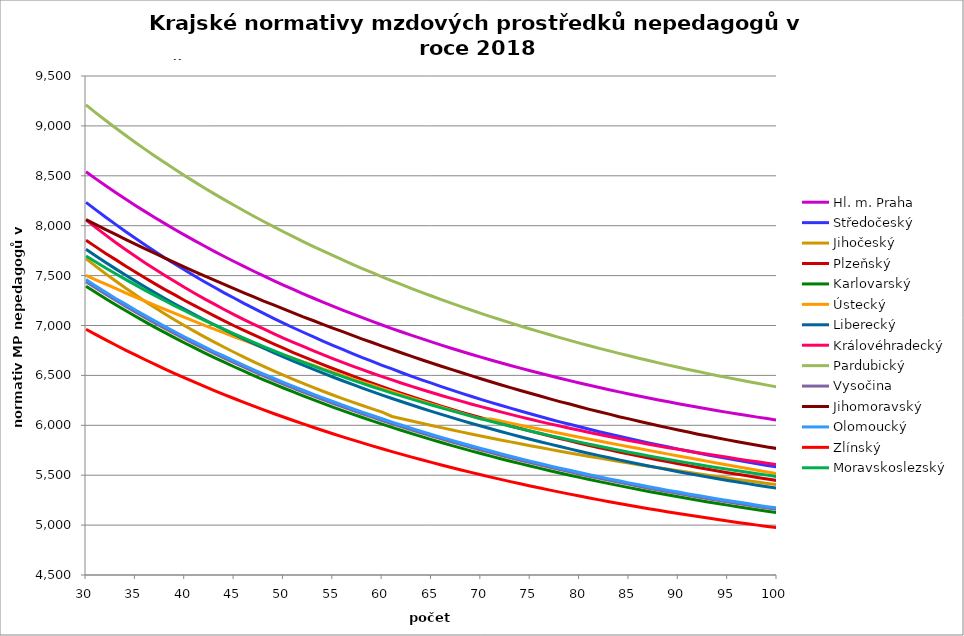
| Category | Hl. m. Praha | Středočeský | Jihočeský | Plzeňský | Karlovarský  | Ústecký   | Liberecký | Královéhradecký | Pardubický | Vysočina | Jihomoravský | Olomoucký | Zlínský | Moravskoslezský |
|---|---|---|---|---|---|---|---|---|---|---|---|---|---|---|
| 30.0 | 8539.701 | 8233.211 | 7669.435 | 7854.668 | 7393.853 | 7502.552 | 7763.411 | 8057.802 | 9210.15 | 7439.113 | 8061.516 | 7460.424 | 6962.583 | 7697.208 |
| 31.0 | 8469.05 | 8158.608 | 7592.32 | 7787.782 | 7330.51 | 7456.418 | 7696.406 | 7981.119 | 9131.246 | 7375.491 | 8011.168 | 7394.475 | 6908.645 | 7636.283 |
| 32.0 | 8400.15 | 8085.345 | 7517.656 | 7722.026 | 7268.722 | 7413.68 | 7631.055 | 7905.882 | 9054.28 | 7313.216 | 7961.446 | 7332.359 | 6855.947 | 7576.796 |
| 33.0 | 8332.945 | 8013.386 | 7445.345 | 7660.16 | 7208.44 | 7371.429 | 7567.303 | 7832.051 | 8979.19 | 7252.512 | 7912.337 | 7271.279 | 6804.45 | 7518.702 |
| 34.0 | 8267.38 | 7942.696 | 7375.293 | 7596.533 | 7149.615 | 7326.888 | 7505.1 | 7762.458 | 8905.914 | 7193.327 | 7863.83 | 7213.798 | 6754.119 | 7461.958 |
| 35.0 | 8203.403 | 7873.242 | 7307.413 | 7536.654 | 7092.199 | 7285.618 | 7444.394 | 7694.092 | 8834.393 | 7135.611 | 7815.914 | 7154.669 | 6704.919 | 7406.523 |
| 36.0 | 8140.964 | 7807.7 | 7241.62 | 7475.053 | 7036.147 | 7244.81 | 7385.138 | 7626.919 | 8764.573 | 7079.318 | 7768.579 | 7099.01 | 6656.817 | 7352.359 |
| 37.0 | 8080.017 | 7740.578 | 7177.838 | 7417.066 | 6981.418 | 7201.782 | 7327.286 | 7563.636 | 8696.4 | 7024.153 | 7721.813 | 7044.211 | 6609.782 | 7299.426 |
| 38.0 | 8020.515 | 7677.217 | 7115.989 | 7359.972 | 6927.97 | 7161.905 | 7270.795 | 7501.395 | 8629.822 | 6970.329 | 7675.607 | 6990.251 | 6563.782 | 7247.691 |
| 39.0 | 7962.415 | 7617.462 | 7056.005 | 7306.287 | 6875.764 | 7122.467 | 7215.623 | 7440.17 | 8564.792 | 6917.804 | 7629.951 | 6937.111 | 6518.789 | 7197.117 |
| 40.0 | 7905.674 | 7556.093 | 6997.817 | 7250.879 | 6824.762 | 7080.876 | 7161.728 | 7379.937 | 8501.261 | 6866.538 | 7584.835 | 6884.774 | 6474.774 | 7147.672 |
| 41.0 | 7850.254 | 7495.704 | 6941.361 | 7198.768 | 6774.929 | 7042.323 | 7109.074 | 7323.227 | 8439.186 | 6816.493 | 7540.249 | 6835.546 | 6431.71 | 7099.323 |
| 42.0 | 7796.115 | 7438.731 | 6886.578 | 7147.401 | 6726.229 | 7001.66 | 7057.623 | 7267.383 | 8378.524 | 6767.402 | 7496.184 | 6787.018 | 6389.572 | 7052.041 |
| 43.0 | 7743.221 | 7382.617 | 6833.41 | 7096.761 | 6678.63 | 6963.963 | 7007.339 | 7214.866 | 8319.232 | 6719.466 | 7455.179 | 6736.913 | 6348.333 | 7005.795 |
| 44.0 | 7691.536 | 7327.344 | 6781.803 | 7046.834 | 6632.099 | 6926.669 | 6958.189 | 7160.656 | 8261.271 | 6672.651 | 7412.101 | 6692 | 6307.971 | 6960.557 |
| 45.0 | 7641.026 | 7275.242 | 6731.703 | 6997.605 | 6586.607 | 6887.327 | 6910.141 | 7109.664 | 8204.604 | 6626.925 | 7369.517 | 6645.482 | 6268.461 | 6916.3 |
| 46.0 | 7591.658 | 7221.559 | 6683.062 | 6951.355 | 6542.124 | 6850.847 | 6863.162 | 7059.394 | 8149.193 | 6582.257 | 7327.419 | 6599.606 | 6229.781 | 6872.998 |
| 47.0 | 7543.402 | 7170.946 | 6635.833 | 6905.712 | 6498.622 | 6814.752 | 6817.223 | 7012.174 | 8095.004 | 6538.401 | 7285.8 | 6556.499 | 6191.911 | 6830.625 |
| 48.0 | 7496.227 | 7121.038 | 6589.97 | 6860.665 | 6456.073 | 6776.668 | 6772.295 | 6965.581 | 8042.003 | 6495.549 | 7244.651 | 6513.952 | 6154.828 | 6789.157 |
| 49.0 | 7450.103 | 7071.819 | 6545.432 | 6816.202 | 6414.451 | 6741.348 | 6728.351 | 6919.604 | 7990.158 | 6453.674 | 7206.345 | 6471.954 | 6118.514 | 6748.571 |
| 50.0 | 7405.004 | 7023.276 | 6502.177 | 6772.312 | 6373.732 | 6706.395 | 6685.363 | 6874.23 | 7939.437 | 6412.747 | 7166.086 | 6430.493 | 6082.948 | 6708.844 |
| 51.0 | 7360.902 | 6977.557 | 6460.166 | 6728.983 | 6333.892 | 6669.508 | 6643.305 | 6831.672 | 7889.809 | 6372.745 | 7126.275 | 6389.561 | 6048.112 | 6669.955 |
| 52.0 | 7317.772 | 6932.43 | 6419.363 | 6688.331 | 6294.907 | 6635.294 | 6602.154 | 6789.637 | 7841.247 | 6333.439 | 7086.903 | 6351.155 | 6013.988 | 6631.882 |
| 53.0 | 7275.588 | 6887.882 | 6379.731 | 6648.167 | 6256.754 | 6601.429 | 6561.885 | 6748.117 | 7793.723 | 6295.014 | 7050.242 | 6313.208 | 5980.56 | 6594.605 |
| 54.0 | 7234.327 | 6843.904 | 6341.238 | 6608.483 | 6219.413 | 6565.685 | 6522.475 | 6707.102 | 7747.209 | 6257.444 | 7011.704 | 6275.711 | 5947.809 | 6558.105 |
| 55.0 | 7193.965 | 6800.483 | 6303.85 | 6569.269 | 6182.863 | 6532.525 | 6483.903 | 6668.702 | 7701.68 | 6220.709 | 6973.585 | 6238.658 | 5915.721 | 6522.363 |
| 56.0 | 7154.48 | 6759.64 | 6267.538 | 6532.547 | 6147.083 | 6499.698 | 6446.146 | 6630.74 | 7657.111 | 6184.787 | 6938.085 | 6202.039 | 5884.278 | 6487.361 |
| 57.0 | 7115.851 | 6719.284 | 6232.271 | 6494.227 | 6112.054 | 6465.045 | 6409.185 | 6593.208 | 7613.477 | 6149.468 | 6900.759 | 6165.848 | 5853.468 | 6453.081 |
| 58.0 | 7078.058 | 6677.425 | 6198.021 | 6458.336 | 6077.758 | 6432.891 | 6373 | 6558.148 | 7570.757 | 6114.924 | 6863.834 | 6131.949 | 5823.273 | 6419.507 |
| 59.0 | 7041.08 | 6640 | 6164.762 | 6422.84 | 6044.177 | 6401.056 | 6337.571 | 6521.431 | 7528.926 | 6081.138 | 6829.439 | 6098.42 | 5793.682 | 6386.621 |
| 60.0 | 7004.897 | 6601.056 | 6132.468 | 6387.732 | 6011.294 | 6367.443 | 6302.881 | 6487.129 | 7487.965 | 6048.09 | 6793.271 | 6065.257 | 5764.68 | 6354.409 |
| 61.0 | 6969.492 | 6564.479 | 6088.277 | 6353.005 | 5979.091 | 6336.251 | 6268.911 | 6455.172 | 7447.852 | 6015.763 | 6759.578 | 6032.452 | 5736.253 | 6322.854 |
| 62.0 | 6934.847 | 6526.413 | 6065.288 | 6320.553 | 5947.553 | 6305.362 | 6235.645 | 6421.562 | 7408.567 | 5983.96 | 6724.144 | 6000 | 5708.39 | 6291.943 |
| 63.0 | 6900.944 | 6490.657 | 6042.645 | 6286.551 | 5916.665 | 6272.745 | 6203.065 | 6390.247 | 7370.09 | 5952.846 | 6691.132 | 5969.67 | 5681.077 | 6261.661 |
| 64.0 | 6867.766 | 6455.291 | 6020.342 | 6254.773 | 5886.41 | 6242.471 | 6171.156 | 6359.236 | 7332.404 | 5922.407 | 6656.41 | 5939.645 | 5654.304 | 6231.994 |
| 65.0 | 6835.298 | 6422.14 | 5998.374 | 6223.314 | 5856.775 | 6212.488 | 6139.903 | 6328.524 | 7295.489 | 5892.626 | 6624.058 | 5908.181 | 5628.058 | 6202.929 |
| 66.0 | 6803.524 | 6387.514 | 5976.735 | 6192.17 | 5827.746 | 6180.822 | 6109.29 | 6298.108 | 7259.329 | 5863.488 | 6592.019 | 5878.77 | 5602.328 | 6174.453 |
| 67.0 | 6772.428 | 6355.054 | 5955.42 | 6161.336 | 5799.309 | 6151.427 | 6079.303 | 6269.856 | 7223.906 | 5834.808 | 6560.289 | 5851.355 | 5577.104 | 6146.554 |
| 68.0 | 6741.997 | 6322.921 | 5934.423 | 6132.595 | 5771.451 | 6122.31 | 6049.929 | 6241.858 | 7189.204 | 5806.745 | 6528.862 | 5822.506 | 5552.375 | 6119.219 |
| 69.0 | 6712.216 | 6291.112 | 5913.74 | 6104.121 | 5744.159 | 6091.554 | 6021.153 | 6214.108 | 7155.208 | 5779.286 | 6497.735 | 5795.612 | 5528.13 | 6092.437 |
| 70.0 | 6683.071 | 6259.622 | 5893.366 | 6075.91 | 5717.421 | 6063 | 5992.963 | 6186.604 | 7121.902 | 5752.418 | 6466.904 | 5768.966 | 5504.361 | 6066.196 |
| 71.0 | 6654.55 | 6230.169 | 5873.295 | 6047.959 | 5691.225 | 6063 | 5965.346 | 6161.152 | 7089.272 | 5726.128 | 6436.364 | 5742.563 | 5481.057 | 6040.486 |
| 72.0 | 6626.64 | 6200.992 | 5853.523 | 6020.263 | 5665.56 | 6042.23 | 5938.29 | 6134.114 | 7057.302 | 5700.24 | 6406.11 | 5716.401 | 5458.21 | 6015.295 |
| 73.0 | 6599.328 | 6172.087 | 5834.045 | 5992.821 | 5640.415 | 6021.601 | 5911.784 | 6109.091 | 7025.98 | 5674.909 | 6378.005 | 5690.476 | 5435.81 | 5990.615 |
| 74.0 | 6572.603 | 6143.45 | 5814.856 | 5967.319 | 5615.779 | 6001.114 | 5885.815 | 6084.272 | 6995.292 | 5650.122 | 6348.297 | 5666.384 | 5413.849 | 5966.434 |
| 75.0 | 6546.453 | 6115.077 | 5795.953 | 5942.034 | 5591.641 | 5980.764 | 5860.372 | 6061.405 | 6965.224 | 5625.868 | 6320.696 | 5640.91 | 5392.318 | 5942.743 |
| 76.0 | 6520.867 | 6088.612 | 5777.331 | 5916.962 | 5567.991 | 5960.553 | 5835.446 | 6036.971 | 6935.766 | 5602.137 | 6293.333 | 5617.236 | 5371.209 | 5919.533 |
| 77.0 | 6495.834 | 6060.743 | 5758.985 | 5892.101 | 5544.821 | 5940.478 | 5811.026 | 6014.458 | 6906.903 | 5578.762 | 6264.407 | 5593.759 | 5350.515 | 5896.794 |
| 78.0 | 6471.344 | 6034.745 | 5740.912 | 5867.448 | 5522.119 | 5920.537 | 5787.101 | 5992.112 | 6878.625 | 5555.89 | 6237.529 | 5570.477 | 5330.227 | 5874.519 |
| 79.0 | 6447.387 | 6010.574 | 5723.107 | 5844.624 | 5499.878 | 5900.73 | 5763.662 | 5969.932 | 6850.92 | 5533.513 | 6212.65 | 5548.922 | 5310.338 | 5852.698 |
| 80.0 | 6423.952 | 5985.004 | 5705.567 | 5820.365 | 5478.088 | 5881.055 | 5740.7 | 5949.603 | 6823.777 | 5511.62 | 6186.213 | 5527.533 | 5290.842 | 5831.323 |
| 81.0 | 6401.031 | 5959.651 | 5688.287 | 5797.905 | 5456.74 | 5861.511 | 5718.205 | 5927.735 | 6797.186 | 5490.203 | 6160 | 5504.798 | 5271.731 | 5810.386 |
| 82.0 | 6378.614 | 5936.076 | 5671.265 | 5775.618 | 5435.827 | 5842.096 | 5696.169 | 5907.692 | 6771.135 | 5469.101 | 6135.734 | 5483.748 | 5252.997 | 5789.88 |
| 83.0 | 6356.693 | 5912.687 | 5654.496 | 5755.075 | 5415.34 | 5822.809 | 5674.583 | 5887.784 | 6745.616 | 5448.459 | 6111.659 | 5462.857 | 5234.636 | 5769.796 |
| 84.0 | 6335.258 | 5889.482 | 5637.976 | 5733.115 | 5395.272 | 5803.649 | 5653.438 | 5868.01 | 6720.617 | 5428.268 | 6086.073 | 5443.601 | 5216.64 | 5750.128 |
| 85.0 | 6314.303 | 5867.987 | 5621.703 | 5712.873 | 5375.614 | 5784.615 | 5632.728 | 5848.368 | 6696.131 | 5408.52 | 6064.071 | 5423.015 | 5199.002 | 5730.869 |
| 86.0 | 6293.817 | 5845.131 | 5605.672 | 5691.234 | 5356.36 | 5767.42 | 5612.443 | 5830.478 | 6672.147 | 5389.206 | 6040.554 | 5404.038 | 5181.718 | 5712.012 |
| 87.0 | 6273.794 | 5823.959 | 5589.881 | 5671.286 | 5337.503 | 5748.622 | 5592.577 | 5811.086 | 6648.657 | 5370.175 | 6017.219 | 5385.193 | 5164.781 | 5693.549 |
| 88.0 | 6254.227 | 5802.939 | 5574.326 | 5651.478 | 5319.035 | 5729.947 | 5573.122 | 5793.424 | 6625.653 | 5351.565 | 5995.711 | 5366.48 | 5148.186 | 5675.476 |
| 89.0 | 6235.107 | 5782.07 | 5559.004 | 5633.315 | 5300.949 | 5711.392 | 5554.07 | 5775.868 | 6603.125 | 5333.369 | 5974.356 | 5347.896 | 5131.926 | 5657.784 |
| 90.0 | 6216.428 | 5761.351 | 5543.912 | 5613.771 | 5283.24 | 5692.958 | 5535.416 | 5760 | 6581.066 | 5315.58 | 5953.153 | 5330.855 | 5115.998 | 5640.469 |
| 91.0 | 6198.182 | 5742.245 | 5529.046 | 5595.85 | 5265.901 | 5674.642 | 5517.153 | 5742.646 | 6559.467 | 5298.191 | 5932.1 | 5312.517 | 5100.394 | 5623.524 |
| 92.0 | 6180.364 | 5723.265 | 5514.405 | 5578.043 | 5248.926 | 5656.443 | 5499.273 | 5725.396 | 6538.322 | 5281.056 | 5911.195 | 5295.7 | 5085.112 | 5606.944 |
| 93.0 | 6162.967 | 5702.964 | 5499.984 | 5560.349 | 5232.309 | 5638.361 | 5481.771 | 5709.804 | 6517.623 | 5264.309 | 5892.029 | 5278.99 | 5070.144 | 5590.723 |
| 94.0 | 6145.984 | 5685.678 | 5485.781 | 5542.767 | 5216.044 | 5620.394 | 5464.64 | 5694.297 | 6497.363 | 5247.945 | 5872.987 | 5262.385 | 5055.488 | 5574.856 |
| 95.0 | 6129.41 | 5667.069 | 5471.793 | 5525.296 | 5200.126 | 5602.541 | 5447.875 | 5678.873 | 6477.534 | 5231.957 | 5854.067 | 5245.885 | 5041.137 | 5559.337 |
| 96.0 | 6113.239 | 5648.582 | 5458.018 | 5509.377 | 5184.549 | 5584.801 | 5431.47 | 5663.533 | 6458.131 | 5216.339 | 5835.269 | 5230.849 | 5027.089 | 5544.162 |
| 97.0 | 6097.464 | 5631.624 | 5444.453 | 5493.549 | 5169.308 | 5567.174 | 5415.419 | 5648.276 | 6439.146 | 5200.95 | 5818.143 | 5215.9 | 5013.337 | 5529.326 |
| 98.0 | 6082.081 | 5614.767 | 5431.095 | 5477.812 | 5154.398 | 5549.657 | 5399.717 | 5634.614 | 6420.573 | 5185.922 | 5801.117 | 5199.689 | 4999.879 | 5514.823 |
| 99.0 | 6067.084 | 5598.01 | 5417.941 | 5462.166 | 5139.813 | 5532.25 | 5384.359 | 5619.512 | 6402.406 | 5171.248 | 5782.657 | 5184.917 | 4986.709 | 5500.649 |
| 100.0 | 6052.468 | 5582.738 | 5404.99 | 5446.608 | 5125.55 | 5514.952 | 5369.339 | 5605.989 | 6384.639 | 5156.925 | 5767.363 | 5171.561 | 4973.825 | 5486.8 |